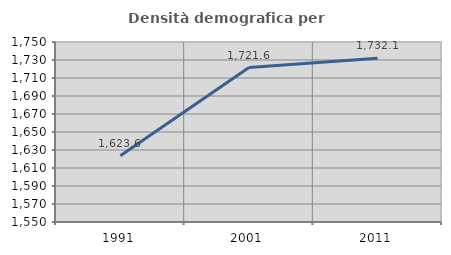
| Category | Densità demografica |
|---|---|
| 1991.0 | 1623.624 |
| 2001.0 | 1721.632 |
| 2011.0 | 1732.053 |